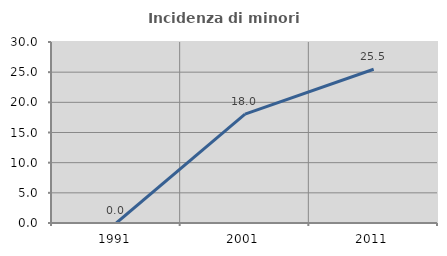
| Category | Incidenza di minori stranieri |
|---|---|
| 1991.0 | 0 |
| 2001.0 | 18.033 |
| 2011.0 | 25.485 |